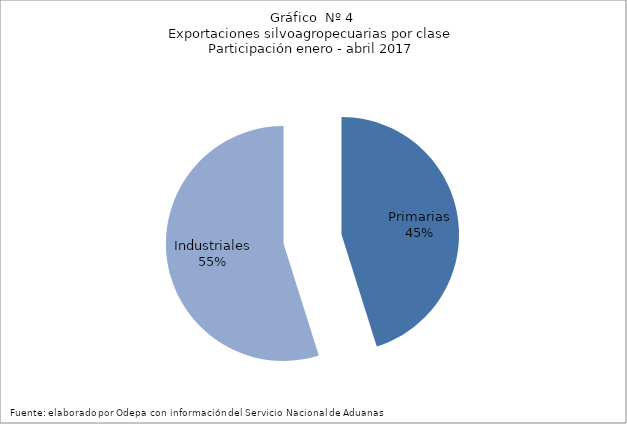
| Category | Series 0 |
|---|---|
| Primarias | 2297089 |
| Industriales | 2790834 |